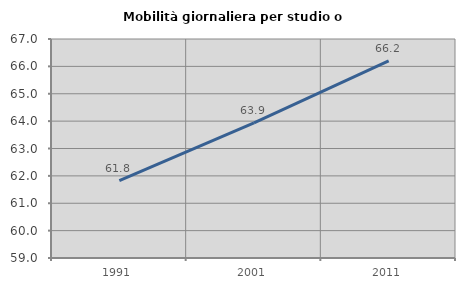
| Category | Mobilità giornaliera per studio o lavoro |
|---|---|
| 1991.0 | 61.825 |
| 2001.0 | 63.936 |
| 2011.0 | 66.2 |